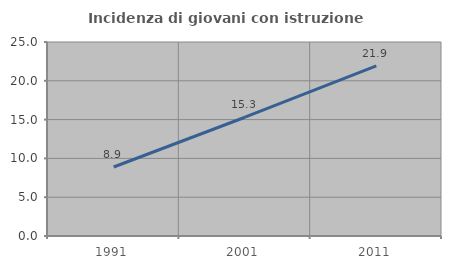
| Category | Incidenza di giovani con istruzione universitaria |
|---|---|
| 1991.0 | 8.889 |
| 2001.0 | 15.306 |
| 2011.0 | 21.918 |